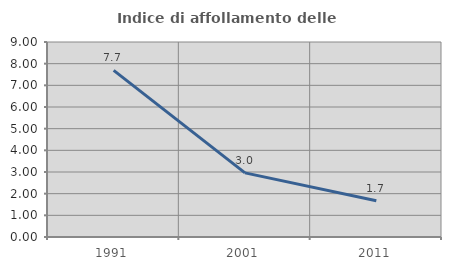
| Category | Indice di affollamento delle abitazioni  |
|---|---|
| 1991.0 | 7.692 |
| 2001.0 | 2.96 |
| 2011.0 | 1.671 |